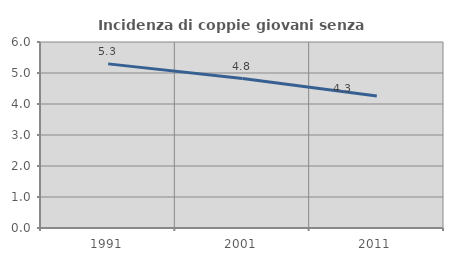
| Category | Incidenza di coppie giovani senza figli |
|---|---|
| 1991.0 | 5.294 |
| 2001.0 | 4.82 |
| 2011.0 | 4.261 |